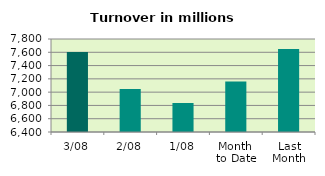
| Category | Series 0 |
|---|---|
| 3/08 | 7602.485 |
| 2/08 | 7046.684 |
| 1/08 | 6836.491 |
| Month 
to Date | 7161.887 |
| Last
Month | 7648.819 |